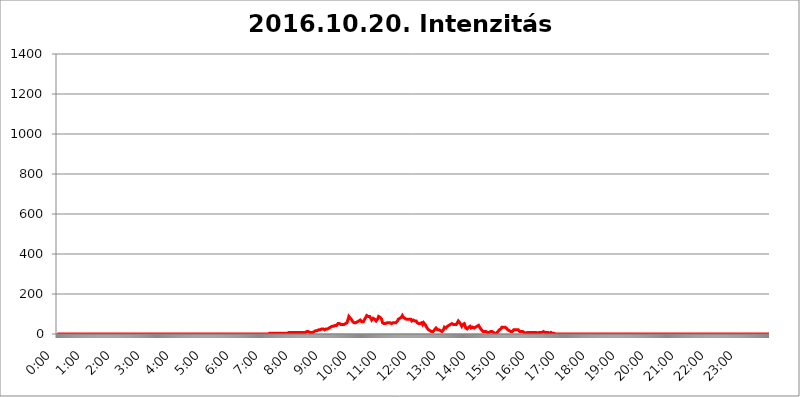
| Category | 2016.10.20. Intenzitás [W/m^2] |
|---|---|
| 0.0 | 0 |
| 0.0006944444444444445 | 0 |
| 0.001388888888888889 | 0 |
| 0.0020833333333333333 | 0 |
| 0.002777777777777778 | 0 |
| 0.003472222222222222 | 0 |
| 0.004166666666666667 | 0 |
| 0.004861111111111111 | 0 |
| 0.005555555555555556 | 0 |
| 0.0062499999999999995 | 0 |
| 0.006944444444444444 | 0 |
| 0.007638888888888889 | 0 |
| 0.008333333333333333 | 0 |
| 0.009027777777777779 | 0 |
| 0.009722222222222222 | 0 |
| 0.010416666666666666 | 0 |
| 0.011111111111111112 | 0 |
| 0.011805555555555555 | 0 |
| 0.012499999999999999 | 0 |
| 0.013194444444444444 | 0 |
| 0.013888888888888888 | 0 |
| 0.014583333333333332 | 0 |
| 0.015277777777777777 | 0 |
| 0.015972222222222224 | 0 |
| 0.016666666666666666 | 0 |
| 0.017361111111111112 | 0 |
| 0.018055555555555557 | 0 |
| 0.01875 | 0 |
| 0.019444444444444445 | 0 |
| 0.02013888888888889 | 0 |
| 0.020833333333333332 | 0 |
| 0.02152777777777778 | 0 |
| 0.022222222222222223 | 0 |
| 0.02291666666666667 | 0 |
| 0.02361111111111111 | 0 |
| 0.024305555555555556 | 0 |
| 0.024999999999999998 | 0 |
| 0.025694444444444447 | 0 |
| 0.02638888888888889 | 0 |
| 0.027083333333333334 | 0 |
| 0.027777777777777776 | 0 |
| 0.02847222222222222 | 0 |
| 0.029166666666666664 | 0 |
| 0.029861111111111113 | 0 |
| 0.030555555555555555 | 0 |
| 0.03125 | 0 |
| 0.03194444444444445 | 0 |
| 0.03263888888888889 | 0 |
| 0.03333333333333333 | 0 |
| 0.034027777777777775 | 0 |
| 0.034722222222222224 | 0 |
| 0.035416666666666666 | 0 |
| 0.036111111111111115 | 0 |
| 0.03680555555555556 | 0 |
| 0.0375 | 0 |
| 0.03819444444444444 | 0 |
| 0.03888888888888889 | 0 |
| 0.03958333333333333 | 0 |
| 0.04027777777777778 | 0 |
| 0.04097222222222222 | 0 |
| 0.041666666666666664 | 0 |
| 0.042361111111111106 | 0 |
| 0.04305555555555556 | 0 |
| 0.043750000000000004 | 0 |
| 0.044444444444444446 | 0 |
| 0.04513888888888889 | 0 |
| 0.04583333333333334 | 0 |
| 0.04652777777777778 | 0 |
| 0.04722222222222222 | 0 |
| 0.04791666666666666 | 0 |
| 0.04861111111111111 | 0 |
| 0.049305555555555554 | 0 |
| 0.049999999999999996 | 0 |
| 0.05069444444444445 | 0 |
| 0.051388888888888894 | 0 |
| 0.052083333333333336 | 0 |
| 0.05277777777777778 | 0 |
| 0.05347222222222222 | 0 |
| 0.05416666666666667 | 0 |
| 0.05486111111111111 | 0 |
| 0.05555555555555555 | 0 |
| 0.05625 | 0 |
| 0.05694444444444444 | 0 |
| 0.057638888888888885 | 0 |
| 0.05833333333333333 | 0 |
| 0.05902777777777778 | 0 |
| 0.059722222222222225 | 0 |
| 0.06041666666666667 | 0 |
| 0.061111111111111116 | 0 |
| 0.06180555555555556 | 0 |
| 0.0625 | 0 |
| 0.06319444444444444 | 0 |
| 0.06388888888888888 | 0 |
| 0.06458333333333334 | 0 |
| 0.06527777777777778 | 0 |
| 0.06597222222222222 | 0 |
| 0.06666666666666667 | 0 |
| 0.06736111111111111 | 0 |
| 0.06805555555555555 | 0 |
| 0.06874999999999999 | 0 |
| 0.06944444444444443 | 0 |
| 0.07013888888888889 | 0 |
| 0.07083333333333333 | 0 |
| 0.07152777777777779 | 0 |
| 0.07222222222222223 | 0 |
| 0.07291666666666667 | 0 |
| 0.07361111111111111 | 0 |
| 0.07430555555555556 | 0 |
| 0.075 | 0 |
| 0.07569444444444444 | 0 |
| 0.0763888888888889 | 0 |
| 0.07708333333333334 | 0 |
| 0.07777777777777778 | 0 |
| 0.07847222222222222 | 0 |
| 0.07916666666666666 | 0 |
| 0.0798611111111111 | 0 |
| 0.08055555555555556 | 0 |
| 0.08125 | 0 |
| 0.08194444444444444 | 0 |
| 0.08263888888888889 | 0 |
| 0.08333333333333333 | 0 |
| 0.08402777777777777 | 0 |
| 0.08472222222222221 | 0 |
| 0.08541666666666665 | 0 |
| 0.08611111111111112 | 0 |
| 0.08680555555555557 | 0 |
| 0.08750000000000001 | 0 |
| 0.08819444444444445 | 0 |
| 0.08888888888888889 | 0 |
| 0.08958333333333333 | 0 |
| 0.09027777777777778 | 0 |
| 0.09097222222222222 | 0 |
| 0.09166666666666667 | 0 |
| 0.09236111111111112 | 0 |
| 0.09305555555555556 | 0 |
| 0.09375 | 0 |
| 0.09444444444444444 | 0 |
| 0.09513888888888888 | 0 |
| 0.09583333333333333 | 0 |
| 0.09652777777777777 | 0 |
| 0.09722222222222222 | 0 |
| 0.09791666666666667 | 0 |
| 0.09861111111111111 | 0 |
| 0.09930555555555555 | 0 |
| 0.09999999999999999 | 0 |
| 0.10069444444444443 | 0 |
| 0.1013888888888889 | 0 |
| 0.10208333333333335 | 0 |
| 0.10277777777777779 | 0 |
| 0.10347222222222223 | 0 |
| 0.10416666666666667 | 0 |
| 0.10486111111111111 | 0 |
| 0.10555555555555556 | 0 |
| 0.10625 | 0 |
| 0.10694444444444444 | 0 |
| 0.1076388888888889 | 0 |
| 0.10833333333333334 | 0 |
| 0.10902777777777778 | 0 |
| 0.10972222222222222 | 0 |
| 0.1111111111111111 | 0 |
| 0.11180555555555556 | 0 |
| 0.11180555555555556 | 0 |
| 0.1125 | 0 |
| 0.11319444444444444 | 0 |
| 0.11388888888888889 | 0 |
| 0.11458333333333333 | 0 |
| 0.11527777777777777 | 0 |
| 0.11597222222222221 | 0 |
| 0.11666666666666665 | 0 |
| 0.1173611111111111 | 0 |
| 0.11805555555555557 | 0 |
| 0.11944444444444445 | 0 |
| 0.12013888888888889 | 0 |
| 0.12083333333333333 | 0 |
| 0.12152777777777778 | 0 |
| 0.12222222222222223 | 0 |
| 0.12291666666666667 | 0 |
| 0.12291666666666667 | 0 |
| 0.12361111111111112 | 0 |
| 0.12430555555555556 | 0 |
| 0.125 | 0 |
| 0.12569444444444444 | 0 |
| 0.12638888888888888 | 0 |
| 0.12708333333333333 | 0 |
| 0.16875 | 0 |
| 0.12847222222222224 | 0 |
| 0.12916666666666668 | 0 |
| 0.12986111111111112 | 0 |
| 0.13055555555555556 | 0 |
| 0.13125 | 0 |
| 0.13194444444444445 | 0 |
| 0.1326388888888889 | 0 |
| 0.13333333333333333 | 0 |
| 0.13402777777777777 | 0 |
| 0.13402777777777777 | 0 |
| 0.13472222222222222 | 0 |
| 0.13541666666666666 | 0 |
| 0.1361111111111111 | 0 |
| 0.13749999999999998 | 0 |
| 0.13819444444444443 | 0 |
| 0.1388888888888889 | 0 |
| 0.13958333333333334 | 0 |
| 0.14027777777777778 | 0 |
| 0.14097222222222222 | 0 |
| 0.14166666666666666 | 0 |
| 0.1423611111111111 | 0 |
| 0.14305555555555557 | 0 |
| 0.14375000000000002 | 0 |
| 0.14444444444444446 | 0 |
| 0.1451388888888889 | 0 |
| 0.1451388888888889 | 0 |
| 0.14652777777777778 | 0 |
| 0.14722222222222223 | 0 |
| 0.14791666666666667 | 0 |
| 0.1486111111111111 | 0 |
| 0.14930555555555555 | 0 |
| 0.15 | 0 |
| 0.15069444444444444 | 0 |
| 0.15138888888888888 | 0 |
| 0.15208333333333332 | 0 |
| 0.15277777777777776 | 0 |
| 0.15347222222222223 | 0 |
| 0.15416666666666667 | 0 |
| 0.15486111111111112 | 0 |
| 0.15555555555555556 | 0 |
| 0.15625 | 0 |
| 0.15694444444444444 | 0 |
| 0.15763888888888888 | 0 |
| 0.15833333333333333 | 0 |
| 0.15902777777777777 | 0 |
| 0.15972222222222224 | 0 |
| 0.16041666666666668 | 0 |
| 0.16111111111111112 | 0 |
| 0.16180555555555556 | 0 |
| 0.1625 | 0 |
| 0.16319444444444445 | 0 |
| 0.1638888888888889 | 0 |
| 0.16458333333333333 | 0 |
| 0.16527777777777777 | 0 |
| 0.16597222222222222 | 0 |
| 0.16666666666666666 | 0 |
| 0.1673611111111111 | 0 |
| 0.16805555555555554 | 0 |
| 0.16874999999999998 | 0 |
| 0.16944444444444443 | 0 |
| 0.17013888888888887 | 0 |
| 0.1708333333333333 | 0 |
| 0.17152777777777775 | 0 |
| 0.17222222222222225 | 0 |
| 0.1729166666666667 | 0 |
| 0.17361111111111113 | 0 |
| 0.17430555555555557 | 0 |
| 0.17500000000000002 | 0 |
| 0.17569444444444446 | 0 |
| 0.1763888888888889 | 0 |
| 0.17708333333333334 | 0 |
| 0.17777777777777778 | 0 |
| 0.17847222222222223 | 0 |
| 0.17916666666666667 | 0 |
| 0.1798611111111111 | 0 |
| 0.18055555555555555 | 0 |
| 0.18125 | 0 |
| 0.18194444444444444 | 0 |
| 0.1826388888888889 | 0 |
| 0.18333333333333335 | 0 |
| 0.1840277777777778 | 0 |
| 0.18472222222222223 | 0 |
| 0.18541666666666667 | 0 |
| 0.18611111111111112 | 0 |
| 0.18680555555555556 | 0 |
| 0.1875 | 0 |
| 0.18819444444444444 | 0 |
| 0.18888888888888888 | 0 |
| 0.18958333333333333 | 0 |
| 0.19027777777777777 | 0 |
| 0.1909722222222222 | 0 |
| 0.19166666666666665 | 0 |
| 0.19236111111111112 | 0 |
| 0.19305555555555554 | 0 |
| 0.19375 | 0 |
| 0.19444444444444445 | 0 |
| 0.1951388888888889 | 0 |
| 0.19583333333333333 | 0 |
| 0.19652777777777777 | 0 |
| 0.19722222222222222 | 0 |
| 0.19791666666666666 | 0 |
| 0.1986111111111111 | 0 |
| 0.19930555555555554 | 0 |
| 0.19999999999999998 | 0 |
| 0.20069444444444443 | 0 |
| 0.20138888888888887 | 0 |
| 0.2020833333333333 | 0 |
| 0.2027777777777778 | 0 |
| 0.2034722222222222 | 0 |
| 0.2041666666666667 | 0 |
| 0.20486111111111113 | 0 |
| 0.20555555555555557 | 0 |
| 0.20625000000000002 | 0 |
| 0.20694444444444446 | 0 |
| 0.2076388888888889 | 0 |
| 0.20833333333333334 | 0 |
| 0.20902777777777778 | 0 |
| 0.20972222222222223 | 0 |
| 0.21041666666666667 | 0 |
| 0.2111111111111111 | 0 |
| 0.21180555555555555 | 0 |
| 0.2125 | 0 |
| 0.21319444444444444 | 0 |
| 0.2138888888888889 | 0 |
| 0.21458333333333335 | 0 |
| 0.2152777777777778 | 0 |
| 0.21597222222222223 | 0 |
| 0.21666666666666667 | 0 |
| 0.21736111111111112 | 0 |
| 0.21805555555555556 | 0 |
| 0.21875 | 0 |
| 0.21944444444444444 | 0 |
| 0.22013888888888888 | 0 |
| 0.22083333333333333 | 0 |
| 0.22152777777777777 | 0 |
| 0.2222222222222222 | 0 |
| 0.22291666666666665 | 0 |
| 0.2236111111111111 | 0 |
| 0.22430555555555556 | 0 |
| 0.225 | 0 |
| 0.22569444444444445 | 0 |
| 0.2263888888888889 | 0 |
| 0.22708333333333333 | 0 |
| 0.22777777777777777 | 0 |
| 0.22847222222222222 | 0 |
| 0.22916666666666666 | 0 |
| 0.2298611111111111 | 0 |
| 0.23055555555555554 | 0 |
| 0.23124999999999998 | 0 |
| 0.23194444444444443 | 0 |
| 0.23263888888888887 | 0 |
| 0.2333333333333333 | 0 |
| 0.2340277777777778 | 0 |
| 0.2347222222222222 | 0 |
| 0.2354166666666667 | 0 |
| 0.23611111111111113 | 0 |
| 0.23680555555555557 | 0 |
| 0.23750000000000002 | 0 |
| 0.23819444444444446 | 0 |
| 0.2388888888888889 | 0 |
| 0.23958333333333334 | 0 |
| 0.24027777777777778 | 0 |
| 0.24097222222222223 | 0 |
| 0.24166666666666667 | 0 |
| 0.2423611111111111 | 0 |
| 0.24305555555555555 | 0 |
| 0.24375 | 0 |
| 0.24444444444444446 | 0 |
| 0.24513888888888888 | 0 |
| 0.24583333333333335 | 0 |
| 0.2465277777777778 | 0 |
| 0.24722222222222223 | 0 |
| 0.24791666666666667 | 0 |
| 0.24861111111111112 | 0 |
| 0.24930555555555556 | 0 |
| 0.25 | 0 |
| 0.25069444444444444 | 0 |
| 0.2513888888888889 | 0 |
| 0.2520833333333333 | 0 |
| 0.25277777777777777 | 0 |
| 0.2534722222222222 | 0 |
| 0.25416666666666665 | 0 |
| 0.2548611111111111 | 0 |
| 0.2555555555555556 | 0 |
| 0.25625000000000003 | 0 |
| 0.2569444444444445 | 0 |
| 0.2576388888888889 | 0 |
| 0.25833333333333336 | 0 |
| 0.2590277777777778 | 0 |
| 0.25972222222222224 | 0 |
| 0.2604166666666667 | 0 |
| 0.2611111111111111 | 0 |
| 0.26180555555555557 | 0 |
| 0.2625 | 0 |
| 0.26319444444444445 | 0 |
| 0.2638888888888889 | 0 |
| 0.26458333333333334 | 0 |
| 0.2652777777777778 | 0 |
| 0.2659722222222222 | 0 |
| 0.26666666666666666 | 0 |
| 0.2673611111111111 | 0 |
| 0.26805555555555555 | 0 |
| 0.26875 | 0 |
| 0.26944444444444443 | 0 |
| 0.2701388888888889 | 0 |
| 0.2708333333333333 | 0 |
| 0.27152777777777776 | 0 |
| 0.2722222222222222 | 0 |
| 0.27291666666666664 | 0 |
| 0.2736111111111111 | 0 |
| 0.2743055555555555 | 0 |
| 0.27499999999999997 | 0 |
| 0.27569444444444446 | 0 |
| 0.27638888888888885 | 0 |
| 0.27708333333333335 | 0 |
| 0.2777777777777778 | 0 |
| 0.27847222222222223 | 0 |
| 0.2791666666666667 | 0 |
| 0.2798611111111111 | 0 |
| 0.28055555555555556 | 0 |
| 0.28125 | 0 |
| 0.28194444444444444 | 0 |
| 0.2826388888888889 | 0 |
| 0.2833333333333333 | 0 |
| 0.28402777777777777 | 0 |
| 0.2847222222222222 | 0 |
| 0.28541666666666665 | 0 |
| 0.28611111111111115 | 0 |
| 0.28680555555555554 | 0 |
| 0.28750000000000003 | 0 |
| 0.2881944444444445 | 0 |
| 0.2888888888888889 | 0 |
| 0.28958333333333336 | 0 |
| 0.2902777777777778 | 0 |
| 0.29097222222222224 | 0 |
| 0.2916666666666667 | 0 |
| 0.2923611111111111 | 0 |
| 0.29305555555555557 | 0 |
| 0.29375 | 0 |
| 0.29444444444444445 | 0 |
| 0.2951388888888889 | 0 |
| 0.29583333333333334 | 0 |
| 0.2965277777777778 | 0 |
| 0.2972222222222222 | 0 |
| 0.29791666666666666 | 3.525 |
| 0.2986111111111111 | 3.525 |
| 0.29930555555555555 | 3.525 |
| 0.3 | 3.525 |
| 0.30069444444444443 | 3.525 |
| 0.3013888888888889 | 3.525 |
| 0.3020833333333333 | 3.525 |
| 0.30277777777777776 | 3.525 |
| 0.3034722222222222 | 3.525 |
| 0.30416666666666664 | 3.525 |
| 0.3048611111111111 | 3.525 |
| 0.3055555555555555 | 3.525 |
| 0.30624999999999997 | 3.525 |
| 0.3069444444444444 | 3.525 |
| 0.3076388888888889 | 3.525 |
| 0.30833333333333335 | 3.525 |
| 0.3090277777777778 | 3.525 |
| 0.30972222222222223 | 3.525 |
| 0.3104166666666667 | 3.525 |
| 0.3111111111111111 | 3.525 |
| 0.31180555555555556 | 3.525 |
| 0.3125 | 3.525 |
| 0.31319444444444444 | 3.525 |
| 0.3138888888888889 | 3.525 |
| 0.3145833333333333 | 3.525 |
| 0.31527777777777777 | 3.525 |
| 0.3159722222222222 | 3.525 |
| 0.31666666666666665 | 3.525 |
| 0.31736111111111115 | 3.525 |
| 0.31805555555555554 | 3.525 |
| 0.31875000000000003 | 3.525 |
| 0.3194444444444445 | 3.525 |
| 0.3201388888888889 | 3.525 |
| 0.32083333333333336 | 3.525 |
| 0.3215277777777778 | 3.525 |
| 0.32222222222222224 | 3.525 |
| 0.3229166666666667 | 3.525 |
| 0.3236111111111111 | 3.525 |
| 0.32430555555555557 | 7.887 |
| 0.325 | 7.887 |
| 0.32569444444444445 | 7.887 |
| 0.3263888888888889 | 7.887 |
| 0.32708333333333334 | 7.887 |
| 0.3277777777777778 | 7.887 |
| 0.3284722222222222 | 7.887 |
| 0.32916666666666666 | 7.887 |
| 0.3298611111111111 | 7.887 |
| 0.33055555555555555 | 7.887 |
| 0.33125 | 7.887 |
| 0.33194444444444443 | 7.887 |
| 0.3326388888888889 | 7.887 |
| 0.3333333333333333 | 7.887 |
| 0.3340277777777778 | 7.887 |
| 0.3347222222222222 | 7.887 |
| 0.3354166666666667 | 7.887 |
| 0.3361111111111111 | 7.887 |
| 0.3368055555555556 | 7.887 |
| 0.33749999999999997 | 7.887 |
| 0.33819444444444446 | 7.887 |
| 0.33888888888888885 | 7.887 |
| 0.33958333333333335 | 7.887 |
| 0.34027777777777773 | 3.525 |
| 0.34097222222222223 | 3.525 |
| 0.3416666666666666 | 7.887 |
| 0.3423611111111111 | 7.887 |
| 0.3430555555555555 | 7.887 |
| 0.34375 | 7.887 |
| 0.3444444444444445 | 7.887 |
| 0.3451388888888889 | 7.887 |
| 0.3458333333333334 | 7.887 |
| 0.34652777777777777 | 7.887 |
| 0.34722222222222227 | 7.887 |
| 0.34791666666666665 | 7.887 |
| 0.34861111111111115 | 12.257 |
| 0.34930555555555554 | 12.257 |
| 0.35000000000000003 | 12.257 |
| 0.3506944444444444 | 12.257 |
| 0.3513888888888889 | 12.257 |
| 0.3520833333333333 | 12.257 |
| 0.3527777777777778 | 7.887 |
| 0.3534722222222222 | 7.887 |
| 0.3541666666666667 | 7.887 |
| 0.3548611111111111 | 7.887 |
| 0.35555555555555557 | 7.887 |
| 0.35625 | 7.887 |
| 0.35694444444444445 | 7.887 |
| 0.3576388888888889 | 7.887 |
| 0.35833333333333334 | 7.887 |
| 0.3590277777777778 | 12.257 |
| 0.3597222222222222 | 12.257 |
| 0.36041666666666666 | 12.257 |
| 0.3611111111111111 | 12.257 |
| 0.36180555555555555 | 12.257 |
| 0.3625 | 16.636 |
| 0.36319444444444443 | 16.636 |
| 0.3638888888888889 | 16.636 |
| 0.3645833333333333 | 16.636 |
| 0.3652777777777778 | 16.636 |
| 0.3659722222222222 | 16.636 |
| 0.3666666666666667 | 21.024 |
| 0.3673611111111111 | 21.024 |
| 0.3680555555555556 | 21.024 |
| 0.36874999999999997 | 21.024 |
| 0.36944444444444446 | 21.024 |
| 0.37013888888888885 | 21.024 |
| 0.37083333333333335 | 25.419 |
| 0.37152777777777773 | 21.024 |
| 0.37222222222222223 | 21.024 |
| 0.3729166666666666 | 25.419 |
| 0.3736111111111111 | 25.419 |
| 0.3743055555555555 | 21.024 |
| 0.375 | 21.024 |
| 0.3756944444444445 | 21.024 |
| 0.3763888888888889 | 21.024 |
| 0.3770833333333334 | 25.419 |
| 0.37777777777777777 | 25.419 |
| 0.37847222222222227 | 25.419 |
| 0.37916666666666665 | 25.419 |
| 0.37986111111111115 | 25.419 |
| 0.38055555555555554 | 29.823 |
| 0.38125000000000003 | 29.823 |
| 0.3819444444444444 | 29.823 |
| 0.3826388888888889 | 29.823 |
| 0.3833333333333333 | 34.234 |
| 0.3840277777777778 | 34.234 |
| 0.3847222222222222 | 38.653 |
| 0.3854166666666667 | 38.653 |
| 0.3861111111111111 | 38.653 |
| 0.38680555555555557 | 38.653 |
| 0.3875 | 38.653 |
| 0.38819444444444445 | 43.079 |
| 0.3888888888888889 | 43.079 |
| 0.38958333333333334 | 43.079 |
| 0.3902777777777778 | 43.079 |
| 0.3909722222222222 | 43.079 |
| 0.39166666666666666 | 43.079 |
| 0.3923611111111111 | 47.511 |
| 0.39305555555555555 | 47.511 |
| 0.39375 | 51.951 |
| 0.39444444444444443 | 51.951 |
| 0.3951388888888889 | 51.951 |
| 0.3958333333333333 | 51.951 |
| 0.3965277777777778 | 51.951 |
| 0.3972222222222222 | 51.951 |
| 0.3979166666666667 | 47.511 |
| 0.3986111111111111 | 47.511 |
| 0.3993055555555556 | 47.511 |
| 0.39999999999999997 | 47.511 |
| 0.40069444444444446 | 47.511 |
| 0.40138888888888885 | 43.079 |
| 0.40208333333333335 | 47.511 |
| 0.40277777777777773 | 47.511 |
| 0.40347222222222223 | 51.951 |
| 0.4041666666666666 | 51.951 |
| 0.4048611111111111 | 56.398 |
| 0.4055555555555555 | 56.398 |
| 0.40625 | 56.398 |
| 0.4069444444444445 | 60.85 |
| 0.4076388888888889 | 69.775 |
| 0.4083333333333334 | 78.722 |
| 0.40902777777777777 | 87.692 |
| 0.40972222222222227 | 83.205 |
| 0.41041666666666665 | 83.205 |
| 0.41111111111111115 | 78.722 |
| 0.41180555555555554 | 78.722 |
| 0.41250000000000003 | 74.246 |
| 0.4131944444444444 | 69.775 |
| 0.4138888888888889 | 65.31 |
| 0.4145833333333333 | 60.85 |
| 0.4152777777777778 | 56.398 |
| 0.4159722222222222 | 56.398 |
| 0.4166666666666667 | 56.398 |
| 0.4173611111111111 | 56.398 |
| 0.41805555555555557 | 56.398 |
| 0.41875 | 56.398 |
| 0.41944444444444445 | 56.398 |
| 0.4201388888888889 | 60.85 |
| 0.42083333333333334 | 60.85 |
| 0.4215277777777778 | 60.85 |
| 0.4222222222222222 | 65.31 |
| 0.42291666666666666 | 65.31 |
| 0.4236111111111111 | 69.775 |
| 0.42430555555555555 | 69.775 |
| 0.425 | 69.775 |
| 0.42569444444444443 | 69.775 |
| 0.4263888888888889 | 65.31 |
| 0.4270833333333333 | 60.85 |
| 0.4277777777777778 | 60.85 |
| 0.4284722222222222 | 56.398 |
| 0.4291666666666667 | 60.85 |
| 0.4298611111111111 | 65.31 |
| 0.4305555555555556 | 69.775 |
| 0.43124999999999997 | 69.775 |
| 0.43194444444444446 | 74.246 |
| 0.43263888888888885 | 83.205 |
| 0.43333333333333335 | 87.692 |
| 0.43402777777777773 | 92.184 |
| 0.43472222222222223 | 92.184 |
| 0.4354166666666666 | 92.184 |
| 0.4361111111111111 | 87.692 |
| 0.4368055555555555 | 87.692 |
| 0.4375 | 92.184 |
| 0.4381944444444445 | 87.692 |
| 0.4388888888888889 | 87.692 |
| 0.4395833333333334 | 78.722 |
| 0.44027777777777777 | 74.246 |
| 0.44097222222222227 | 69.775 |
| 0.44166666666666665 | 74.246 |
| 0.44236111111111115 | 74.246 |
| 0.44305555555555554 | 78.722 |
| 0.44375000000000003 | 74.246 |
| 0.4444444444444444 | 74.246 |
| 0.4451388888888889 | 74.246 |
| 0.4458333333333333 | 69.775 |
| 0.4465277777777778 | 69.775 |
| 0.4472222222222222 | 65.31 |
| 0.4479166666666667 | 69.775 |
| 0.4486111111111111 | 69.775 |
| 0.44930555555555557 | 74.246 |
| 0.45 | 74.246 |
| 0.45069444444444445 | 87.692 |
| 0.4513888888888889 | 83.205 |
| 0.45208333333333334 | 83.205 |
| 0.4527777777777778 | 83.205 |
| 0.4534722222222222 | 87.692 |
| 0.45416666666666666 | 83.205 |
| 0.4548611111111111 | 74.246 |
| 0.45555555555555555 | 65.31 |
| 0.45625 | 56.398 |
| 0.45694444444444443 | 56.398 |
| 0.4576388888888889 | 51.951 |
| 0.4583333333333333 | 51.951 |
| 0.4590277777777778 | 47.511 |
| 0.4597222222222222 | 51.951 |
| 0.4604166666666667 | 51.951 |
| 0.4611111111111111 | 56.398 |
| 0.4618055555555556 | 56.398 |
| 0.46249999999999997 | 56.398 |
| 0.46319444444444446 | 56.398 |
| 0.46388888888888885 | 56.398 |
| 0.46458333333333335 | 56.398 |
| 0.46527777777777773 | 56.398 |
| 0.46597222222222223 | 56.398 |
| 0.4666666666666666 | 56.398 |
| 0.4673611111111111 | 51.951 |
| 0.4680555555555555 | 51.951 |
| 0.46875 | 51.951 |
| 0.4694444444444445 | 51.951 |
| 0.4701388888888889 | 56.398 |
| 0.4708333333333334 | 56.398 |
| 0.47152777777777777 | 56.398 |
| 0.47222222222222227 | 56.398 |
| 0.47291666666666665 | 56.398 |
| 0.47361111111111115 | 56.398 |
| 0.47430555555555554 | 56.398 |
| 0.47500000000000003 | 56.398 |
| 0.4756944444444444 | 56.398 |
| 0.4763888888888889 | 56.398 |
| 0.4770833333333333 | 65.31 |
| 0.4777777777777778 | 65.31 |
| 0.4784722222222222 | 74.246 |
| 0.4791666666666667 | 74.246 |
| 0.4798611111111111 | 78.722 |
| 0.48055555555555557 | 78.722 |
| 0.48125 | 83.205 |
| 0.48194444444444445 | 78.722 |
| 0.4826388888888889 | 83.205 |
| 0.48333333333333334 | 83.205 |
| 0.4840277777777778 | 92.184 |
| 0.4847222222222222 | 87.692 |
| 0.48541666666666666 | 83.205 |
| 0.4861111111111111 | 83.205 |
| 0.48680555555555555 | 78.722 |
| 0.4875 | 78.722 |
| 0.48819444444444443 | 74.246 |
| 0.4888888888888889 | 74.246 |
| 0.4895833333333333 | 74.246 |
| 0.4902777777777778 | 74.246 |
| 0.4909722222222222 | 74.246 |
| 0.4916666666666667 | 74.246 |
| 0.4923611111111111 | 74.246 |
| 0.4930555555555556 | 74.246 |
| 0.49374999999999997 | 74.246 |
| 0.49444444444444446 | 74.246 |
| 0.49513888888888885 | 74.246 |
| 0.49583333333333335 | 74.246 |
| 0.49652777777777773 | 69.775 |
| 0.49722222222222223 | 65.31 |
| 0.4979166666666666 | 65.31 |
| 0.4986111111111111 | 65.31 |
| 0.4993055555555555 | 69.775 |
| 0.5 | 69.775 |
| 0.5006944444444444 | 69.775 |
| 0.5013888888888889 | 65.31 |
| 0.5020833333333333 | 69.775 |
| 0.5027777777777778 | 69.775 |
| 0.5034722222222222 | 65.31 |
| 0.5041666666666667 | 60.85 |
| 0.5048611111111111 | 56.398 |
| 0.5055555555555555 | 51.951 |
| 0.50625 | 51.951 |
| 0.5069444444444444 | 51.951 |
| 0.5076388888888889 | 51.951 |
| 0.5083333333333333 | 51.951 |
| 0.5090277777777777 | 51.951 |
| 0.5097222222222222 | 56.398 |
| 0.5104166666666666 | 56.398 |
| 0.5111111111111112 | 56.398 |
| 0.5118055555555555 | 51.951 |
| 0.5125000000000001 | 47.511 |
| 0.5131944444444444 | 51.951 |
| 0.513888888888889 | 56.398 |
| 0.5145833333333333 | 56.398 |
| 0.5152777777777778 | 56.398 |
| 0.5159722222222222 | 47.511 |
| 0.5166666666666667 | 43.079 |
| 0.517361111111111 | 38.653 |
| 0.5180555555555556 | 34.234 |
| 0.5187499999999999 | 29.823 |
| 0.5194444444444445 | 29.823 |
| 0.5201388888888888 | 25.419 |
| 0.5208333333333334 | 21.024 |
| 0.5215277777777778 | 21.024 |
| 0.5222222222222223 | 16.636 |
| 0.5229166666666667 | 16.636 |
| 0.5236111111111111 | 12.257 |
| 0.5243055555555556 | 12.257 |
| 0.525 | 12.257 |
| 0.5256944444444445 | 12.257 |
| 0.5263888888888889 | 7.887 |
| 0.5270833333333333 | 12.257 |
| 0.5277777777777778 | 12.257 |
| 0.5284722222222222 | 16.636 |
| 0.5291666666666667 | 21.024 |
| 0.5298611111111111 | 21.024 |
| 0.5305555555555556 | 25.419 |
| 0.53125 | 29.823 |
| 0.5319444444444444 | 25.419 |
| 0.5326388888888889 | 25.419 |
| 0.5333333333333333 | 21.024 |
| 0.5340277777777778 | 21.024 |
| 0.5347222222222222 | 21.024 |
| 0.5354166666666667 | 21.024 |
| 0.5361111111111111 | 21.024 |
| 0.5368055555555555 | 21.024 |
| 0.5375 | 16.636 |
| 0.5381944444444444 | 12.257 |
| 0.5388888888888889 | 12.257 |
| 0.5395833333333333 | 12.257 |
| 0.5402777777777777 | 12.257 |
| 0.5409722222222222 | 16.636 |
| 0.5416666666666666 | 21.024 |
| 0.5423611111111112 | 25.419 |
| 0.5430555555555555 | 34.234 |
| 0.5437500000000001 | 34.234 |
| 0.5444444444444444 | 34.234 |
| 0.545138888888889 | 29.823 |
| 0.5458333333333333 | 29.823 |
| 0.5465277777777778 | 34.234 |
| 0.5472222222222222 | 38.653 |
| 0.5479166666666667 | 43.079 |
| 0.548611111111111 | 43.079 |
| 0.5493055555555556 | 43.079 |
| 0.5499999999999999 | 43.079 |
| 0.5506944444444445 | 43.079 |
| 0.5513888888888888 | 47.511 |
| 0.5520833333333334 | 47.511 |
| 0.5527777777777778 | 47.511 |
| 0.5534722222222223 | 51.951 |
| 0.5541666666666667 | 51.951 |
| 0.5548611111111111 | 51.951 |
| 0.5555555555555556 | 47.511 |
| 0.55625 | 47.511 |
| 0.5569444444444445 | 47.511 |
| 0.5576388888888889 | 47.511 |
| 0.5583333333333333 | 47.511 |
| 0.5590277777777778 | 47.511 |
| 0.5597222222222222 | 47.511 |
| 0.5604166666666667 | 51.951 |
| 0.5611111111111111 | 56.398 |
| 0.5618055555555556 | 60.85 |
| 0.5625 | 65.31 |
| 0.5631944444444444 | 60.85 |
| 0.5638888888888889 | 60.85 |
| 0.5645833333333333 | 56.398 |
| 0.5652777777777778 | 51.951 |
| 0.5659722222222222 | 47.511 |
| 0.5666666666666667 | 43.079 |
| 0.5673611111111111 | 38.653 |
| 0.5680555555555555 | 43.079 |
| 0.56875 | 47.511 |
| 0.5694444444444444 | 47.511 |
| 0.5701388888888889 | 51.951 |
| 0.5708333333333333 | 51.951 |
| 0.5715277777777777 | 47.511 |
| 0.5722222222222222 | 38.653 |
| 0.5729166666666666 | 29.823 |
| 0.5736111111111112 | 29.823 |
| 0.5743055555555555 | 25.419 |
| 0.5750000000000001 | 25.419 |
| 0.5756944444444444 | 25.419 |
| 0.576388888888889 | 29.823 |
| 0.5770833333333333 | 34.234 |
| 0.5777777777777778 | 34.234 |
| 0.5784722222222222 | 38.653 |
| 0.5791666666666667 | 38.653 |
| 0.579861111111111 | 34.234 |
| 0.5805555555555556 | 29.823 |
| 0.5812499999999999 | 29.823 |
| 0.5819444444444445 | 29.823 |
| 0.5826388888888888 | 34.234 |
| 0.5833333333333334 | 34.234 |
| 0.5840277777777778 | 34.234 |
| 0.5847222222222223 | 29.823 |
| 0.5854166666666667 | 29.823 |
| 0.5861111111111111 | 29.823 |
| 0.5868055555555556 | 34.234 |
| 0.5875 | 34.234 |
| 0.5881944444444445 | 34.234 |
| 0.5888888888888889 | 38.653 |
| 0.5895833333333333 | 43.079 |
| 0.5902777777777778 | 43.079 |
| 0.5909722222222222 | 43.079 |
| 0.5916666666666667 | 43.079 |
| 0.5923611111111111 | 38.653 |
| 0.5930555555555556 | 29.823 |
| 0.59375 | 29.823 |
| 0.5944444444444444 | 25.419 |
| 0.5951388888888889 | 21.024 |
| 0.5958333333333333 | 21.024 |
| 0.5965277777777778 | 16.636 |
| 0.5972222222222222 | 12.257 |
| 0.5979166666666667 | 12.257 |
| 0.5986111111111111 | 12.257 |
| 0.5993055555555555 | 12.257 |
| 0.6 | 12.257 |
| 0.6006944444444444 | 12.257 |
| 0.6013888888888889 | 12.257 |
| 0.6020833333333333 | 12.257 |
| 0.6027777777777777 | 7.887 |
| 0.6034722222222222 | 7.887 |
| 0.6041666666666666 | 7.887 |
| 0.6048611111111112 | 7.887 |
| 0.6055555555555555 | 7.887 |
| 0.6062500000000001 | 12.257 |
| 0.6069444444444444 | 12.257 |
| 0.607638888888889 | 12.257 |
| 0.6083333333333333 | 12.257 |
| 0.6090277777777778 | 12.257 |
| 0.6097222222222222 | 12.257 |
| 0.6104166666666667 | 7.887 |
| 0.611111111111111 | 7.887 |
| 0.6118055555555556 | 7.887 |
| 0.6124999999999999 | 7.887 |
| 0.6131944444444445 | 7.887 |
| 0.6138888888888888 | 3.525 |
| 0.6145833333333334 | 7.887 |
| 0.6152777777777778 | 3.525 |
| 0.6159722222222223 | 3.525 |
| 0.6166666666666667 | 3.525 |
| 0.6173611111111111 | 7.887 |
| 0.6180555555555556 | 12.257 |
| 0.61875 | 12.257 |
| 0.6194444444444445 | 16.636 |
| 0.6201388888888889 | 21.024 |
| 0.6208333333333333 | 21.024 |
| 0.6215277777777778 | 25.419 |
| 0.6222222222222222 | 25.419 |
| 0.6229166666666667 | 29.823 |
| 0.6236111111111111 | 34.234 |
| 0.6243055555555556 | 34.234 |
| 0.625 | 34.234 |
| 0.6256944444444444 | 34.234 |
| 0.6263888888888889 | 34.234 |
| 0.6270833333333333 | 34.234 |
| 0.6277777777777778 | 34.234 |
| 0.6284722222222222 | 34.234 |
| 0.6291666666666667 | 29.823 |
| 0.6298611111111111 | 29.823 |
| 0.6305555555555555 | 29.823 |
| 0.63125 | 25.419 |
| 0.6319444444444444 | 21.024 |
| 0.6326388888888889 | 21.024 |
| 0.6333333333333333 | 16.636 |
| 0.6340277777777777 | 16.636 |
| 0.6347222222222222 | 12.257 |
| 0.6354166666666666 | 12.257 |
| 0.6361111111111112 | 12.257 |
| 0.6368055555555555 | 12.257 |
| 0.6375000000000001 | 12.257 |
| 0.6381944444444444 | 12.257 |
| 0.638888888888889 | 16.636 |
| 0.6395833333333333 | 16.636 |
| 0.6402777777777778 | 21.024 |
| 0.6409722222222222 | 21.024 |
| 0.6416666666666667 | 21.024 |
| 0.642361111111111 | 21.024 |
| 0.6430555555555556 | 16.636 |
| 0.6437499999999999 | 21.024 |
| 0.6444444444444445 | 21.024 |
| 0.6451388888888888 | 21.024 |
| 0.6458333333333334 | 21.024 |
| 0.6465277777777778 | 21.024 |
| 0.6472222222222223 | 16.636 |
| 0.6479166666666667 | 16.636 |
| 0.6486111111111111 | 12.257 |
| 0.6493055555555556 | 12.257 |
| 0.65 | 12.257 |
| 0.6506944444444445 | 12.257 |
| 0.6513888888888889 | 12.257 |
| 0.6520833333333333 | 12.257 |
| 0.6527777777777778 | 12.257 |
| 0.6534722222222222 | 7.887 |
| 0.6541666666666667 | 7.887 |
| 0.6548611111111111 | 7.887 |
| 0.6555555555555556 | 7.887 |
| 0.65625 | 7.887 |
| 0.6569444444444444 | 3.525 |
| 0.6576388888888889 | 7.887 |
| 0.6583333333333333 | 7.887 |
| 0.6590277777777778 | 7.887 |
| 0.6597222222222222 | 7.887 |
| 0.6604166666666667 | 7.887 |
| 0.6611111111111111 | 7.887 |
| 0.6618055555555555 | 7.887 |
| 0.6625 | 7.887 |
| 0.6631944444444444 | 7.887 |
| 0.6638888888888889 | 3.525 |
| 0.6645833333333333 | 3.525 |
| 0.6652777777777777 | 7.887 |
| 0.6659722222222222 | 7.887 |
| 0.6666666666666666 | 7.887 |
| 0.6673611111111111 | 7.887 |
| 0.6680555555555556 | 7.887 |
| 0.6687500000000001 | 7.887 |
| 0.6694444444444444 | 7.887 |
| 0.6701388888888888 | 7.887 |
| 0.6708333333333334 | 7.887 |
| 0.6715277777777778 | 7.887 |
| 0.6722222222222222 | 7.887 |
| 0.6729166666666666 | 3.525 |
| 0.6736111111111112 | 3.525 |
| 0.6743055555555556 | 3.525 |
| 0.6749999999999999 | 3.525 |
| 0.6756944444444444 | 7.887 |
| 0.6763888888888889 | 3.525 |
| 0.6770833333333334 | 7.887 |
| 0.6777777777777777 | 7.887 |
| 0.6784722222222223 | 12.257 |
| 0.6791666666666667 | 7.887 |
| 0.6798611111111111 | 7.887 |
| 0.6805555555555555 | 12.257 |
| 0.68125 | 12.257 |
| 0.6819444444444445 | 12.257 |
| 0.6826388888888889 | 12.257 |
| 0.6833333333333332 | 12.257 |
| 0.6840277777777778 | 7.887 |
| 0.6847222222222222 | 7.887 |
| 0.6854166666666667 | 7.887 |
| 0.686111111111111 | 7.887 |
| 0.6868055555555556 | 7.887 |
| 0.6875 | 7.887 |
| 0.6881944444444444 | 7.887 |
| 0.688888888888889 | 7.887 |
| 0.6895833333333333 | 3.525 |
| 0.6902777777777778 | 3.525 |
| 0.6909722222222222 | 3.525 |
| 0.6916666666666668 | 7.887 |
| 0.6923611111111111 | 7.887 |
| 0.6930555555555555 | 7.887 |
| 0.69375 | 7.887 |
| 0.6944444444444445 | 3.525 |
| 0.6951388888888889 | 3.525 |
| 0.6958333333333333 | 3.525 |
| 0.6965277777777777 | 3.525 |
| 0.6972222222222223 | 3.525 |
| 0.6979166666666666 | 0 |
| 0.6986111111111111 | 0 |
| 0.6993055555555556 | 0 |
| 0.7000000000000001 | 0 |
| 0.7006944444444444 | 0 |
| 0.7013888888888888 | 0 |
| 0.7020833333333334 | 0 |
| 0.7027777777777778 | 0 |
| 0.7034722222222222 | 0 |
| 0.7041666666666666 | 0 |
| 0.7048611111111112 | 0 |
| 0.7055555555555556 | 0 |
| 0.7062499999999999 | 0 |
| 0.7069444444444444 | 0 |
| 0.7076388888888889 | 0 |
| 0.7083333333333334 | 0 |
| 0.7090277777777777 | 0 |
| 0.7097222222222223 | 0 |
| 0.7104166666666667 | 0 |
| 0.7111111111111111 | 0 |
| 0.7118055555555555 | 0 |
| 0.7125 | 0 |
| 0.7131944444444445 | 0 |
| 0.7138888888888889 | 0 |
| 0.7145833333333332 | 0 |
| 0.7152777777777778 | 0 |
| 0.7159722222222222 | 0 |
| 0.7166666666666667 | 0 |
| 0.717361111111111 | 0 |
| 0.7180555555555556 | 0 |
| 0.71875 | 0 |
| 0.7194444444444444 | 0 |
| 0.720138888888889 | 0 |
| 0.7208333333333333 | 0 |
| 0.7215277777777778 | 0 |
| 0.7222222222222222 | 0 |
| 0.7229166666666668 | 0 |
| 0.7236111111111111 | 0 |
| 0.7243055555555555 | 0 |
| 0.725 | 0 |
| 0.7256944444444445 | 0 |
| 0.7263888888888889 | 0 |
| 0.7270833333333333 | 0 |
| 0.7277777777777777 | 0 |
| 0.7284722222222223 | 0 |
| 0.7291666666666666 | 0 |
| 0.7298611111111111 | 0 |
| 0.7305555555555556 | 0 |
| 0.7312500000000001 | 0 |
| 0.7319444444444444 | 0 |
| 0.7326388888888888 | 0 |
| 0.7333333333333334 | 0 |
| 0.7340277777777778 | 0 |
| 0.7347222222222222 | 0 |
| 0.7354166666666666 | 0 |
| 0.7361111111111112 | 0 |
| 0.7368055555555556 | 0 |
| 0.7374999999999999 | 0 |
| 0.7381944444444444 | 0 |
| 0.7388888888888889 | 0 |
| 0.7395833333333334 | 0 |
| 0.7402777777777777 | 0 |
| 0.7409722222222223 | 0 |
| 0.7416666666666667 | 0 |
| 0.7423611111111111 | 0 |
| 0.7430555555555555 | 0 |
| 0.74375 | 0 |
| 0.7444444444444445 | 0 |
| 0.7451388888888889 | 0 |
| 0.7458333333333332 | 0 |
| 0.7465277777777778 | 0 |
| 0.7472222222222222 | 0 |
| 0.7479166666666667 | 0 |
| 0.748611111111111 | 0 |
| 0.7493055555555556 | 0 |
| 0.75 | 0 |
| 0.7506944444444444 | 0 |
| 0.751388888888889 | 0 |
| 0.7520833333333333 | 0 |
| 0.7527777777777778 | 0 |
| 0.7534722222222222 | 0 |
| 0.7541666666666668 | 0 |
| 0.7548611111111111 | 0 |
| 0.7555555555555555 | 0 |
| 0.75625 | 0 |
| 0.7569444444444445 | 0 |
| 0.7576388888888889 | 0 |
| 0.7583333333333333 | 0 |
| 0.7590277777777777 | 0 |
| 0.7597222222222223 | 0 |
| 0.7604166666666666 | 0 |
| 0.7611111111111111 | 0 |
| 0.7618055555555556 | 0 |
| 0.7625000000000001 | 0 |
| 0.7631944444444444 | 0 |
| 0.7638888888888888 | 0 |
| 0.7645833333333334 | 0 |
| 0.7652777777777778 | 0 |
| 0.7659722222222222 | 0 |
| 0.7666666666666666 | 0 |
| 0.7673611111111112 | 0 |
| 0.7680555555555556 | 0 |
| 0.7687499999999999 | 0 |
| 0.7694444444444444 | 0 |
| 0.7701388888888889 | 0 |
| 0.7708333333333334 | 0 |
| 0.7715277777777777 | 0 |
| 0.7722222222222223 | 0 |
| 0.7729166666666667 | 0 |
| 0.7736111111111111 | 0 |
| 0.7743055555555555 | 0 |
| 0.775 | 0 |
| 0.7756944444444445 | 0 |
| 0.7763888888888889 | 0 |
| 0.7770833333333332 | 0 |
| 0.7777777777777778 | 0 |
| 0.7784722222222222 | 0 |
| 0.7791666666666667 | 0 |
| 0.779861111111111 | 0 |
| 0.7805555555555556 | 0 |
| 0.78125 | 0 |
| 0.7819444444444444 | 0 |
| 0.782638888888889 | 0 |
| 0.7833333333333333 | 0 |
| 0.7840277777777778 | 0 |
| 0.7847222222222222 | 0 |
| 0.7854166666666668 | 0 |
| 0.7861111111111111 | 0 |
| 0.7868055555555555 | 0 |
| 0.7875 | 0 |
| 0.7881944444444445 | 0 |
| 0.7888888888888889 | 0 |
| 0.7895833333333333 | 0 |
| 0.7902777777777777 | 0 |
| 0.7909722222222223 | 0 |
| 0.7916666666666666 | 0 |
| 0.7923611111111111 | 0 |
| 0.7930555555555556 | 0 |
| 0.7937500000000001 | 0 |
| 0.7944444444444444 | 0 |
| 0.7951388888888888 | 0 |
| 0.7958333333333334 | 0 |
| 0.7965277777777778 | 0 |
| 0.7972222222222222 | 0 |
| 0.7979166666666666 | 0 |
| 0.7986111111111112 | 0 |
| 0.7993055555555556 | 0 |
| 0.7999999999999999 | 0 |
| 0.8006944444444444 | 0 |
| 0.8013888888888889 | 0 |
| 0.8020833333333334 | 0 |
| 0.8027777777777777 | 0 |
| 0.8034722222222223 | 0 |
| 0.8041666666666667 | 0 |
| 0.8048611111111111 | 0 |
| 0.8055555555555555 | 0 |
| 0.80625 | 0 |
| 0.8069444444444445 | 0 |
| 0.8076388888888889 | 0 |
| 0.8083333333333332 | 0 |
| 0.8090277777777778 | 0 |
| 0.8097222222222222 | 0 |
| 0.8104166666666667 | 0 |
| 0.811111111111111 | 0 |
| 0.8118055555555556 | 0 |
| 0.8125 | 0 |
| 0.8131944444444444 | 0 |
| 0.813888888888889 | 0 |
| 0.8145833333333333 | 0 |
| 0.8152777777777778 | 0 |
| 0.8159722222222222 | 0 |
| 0.8166666666666668 | 0 |
| 0.8173611111111111 | 0 |
| 0.8180555555555555 | 0 |
| 0.81875 | 0 |
| 0.8194444444444445 | 0 |
| 0.8201388888888889 | 0 |
| 0.8208333333333333 | 0 |
| 0.8215277777777777 | 0 |
| 0.8222222222222223 | 0 |
| 0.8229166666666666 | 0 |
| 0.8236111111111111 | 0 |
| 0.8243055555555556 | 0 |
| 0.8250000000000001 | 0 |
| 0.8256944444444444 | 0 |
| 0.8263888888888888 | 0 |
| 0.8270833333333334 | 0 |
| 0.8277777777777778 | 0 |
| 0.8284722222222222 | 0 |
| 0.8291666666666666 | 0 |
| 0.8298611111111112 | 0 |
| 0.8305555555555556 | 0 |
| 0.8312499999999999 | 0 |
| 0.8319444444444444 | 0 |
| 0.8326388888888889 | 0 |
| 0.8333333333333334 | 0 |
| 0.8340277777777777 | 0 |
| 0.8347222222222223 | 0 |
| 0.8354166666666667 | 0 |
| 0.8361111111111111 | 0 |
| 0.8368055555555555 | 0 |
| 0.8375 | 0 |
| 0.8381944444444445 | 0 |
| 0.8388888888888889 | 0 |
| 0.8395833333333332 | 0 |
| 0.8402777777777778 | 0 |
| 0.8409722222222222 | 0 |
| 0.8416666666666667 | 0 |
| 0.842361111111111 | 0 |
| 0.8430555555555556 | 0 |
| 0.84375 | 0 |
| 0.8444444444444444 | 0 |
| 0.845138888888889 | 0 |
| 0.8458333333333333 | 0 |
| 0.8465277777777778 | 0 |
| 0.8472222222222222 | 0 |
| 0.8479166666666668 | 0 |
| 0.8486111111111111 | 0 |
| 0.8493055555555555 | 0 |
| 0.85 | 0 |
| 0.8506944444444445 | 0 |
| 0.8513888888888889 | 0 |
| 0.8520833333333333 | 0 |
| 0.8527777777777777 | 0 |
| 0.8534722222222223 | 0 |
| 0.8541666666666666 | 0 |
| 0.8548611111111111 | 0 |
| 0.8555555555555556 | 0 |
| 0.8562500000000001 | 0 |
| 0.8569444444444444 | 0 |
| 0.8576388888888888 | 0 |
| 0.8583333333333334 | 0 |
| 0.8590277777777778 | 0 |
| 0.8597222222222222 | 0 |
| 0.8604166666666666 | 0 |
| 0.8611111111111112 | 0 |
| 0.8618055555555556 | 0 |
| 0.8624999999999999 | 0 |
| 0.8631944444444444 | 0 |
| 0.8638888888888889 | 0 |
| 0.8645833333333334 | 0 |
| 0.8652777777777777 | 0 |
| 0.8659722222222223 | 0 |
| 0.8666666666666667 | 0 |
| 0.8673611111111111 | 0 |
| 0.8680555555555555 | 0 |
| 0.86875 | 0 |
| 0.8694444444444445 | 0 |
| 0.8701388888888889 | 0 |
| 0.8708333333333332 | 0 |
| 0.8715277777777778 | 0 |
| 0.8722222222222222 | 0 |
| 0.8729166666666667 | 0 |
| 0.873611111111111 | 0 |
| 0.8743055555555556 | 0 |
| 0.875 | 0 |
| 0.8756944444444444 | 0 |
| 0.876388888888889 | 0 |
| 0.8770833333333333 | 0 |
| 0.8777777777777778 | 0 |
| 0.8784722222222222 | 0 |
| 0.8791666666666668 | 0 |
| 0.8798611111111111 | 0 |
| 0.8805555555555555 | 0 |
| 0.88125 | 0 |
| 0.8819444444444445 | 0 |
| 0.8826388888888889 | 0 |
| 0.8833333333333333 | 0 |
| 0.8840277777777777 | 0 |
| 0.8847222222222223 | 0 |
| 0.8854166666666666 | 0 |
| 0.8861111111111111 | 0 |
| 0.8868055555555556 | 0 |
| 0.8875000000000001 | 0 |
| 0.8881944444444444 | 0 |
| 0.8888888888888888 | 0 |
| 0.8895833333333334 | 0 |
| 0.8902777777777778 | 0 |
| 0.8909722222222222 | 0 |
| 0.8916666666666666 | 0 |
| 0.8923611111111112 | 0 |
| 0.8930555555555556 | 0 |
| 0.8937499999999999 | 0 |
| 0.8944444444444444 | 0 |
| 0.8951388888888889 | 0 |
| 0.8958333333333334 | 0 |
| 0.8965277777777777 | 0 |
| 0.8972222222222223 | 0 |
| 0.8979166666666667 | 0 |
| 0.8986111111111111 | 0 |
| 0.8993055555555555 | 0 |
| 0.9 | 0 |
| 0.9006944444444445 | 0 |
| 0.9013888888888889 | 0 |
| 0.9020833333333332 | 0 |
| 0.9027777777777778 | 0 |
| 0.9034722222222222 | 0 |
| 0.9041666666666667 | 0 |
| 0.904861111111111 | 0 |
| 0.9055555555555556 | 0 |
| 0.90625 | 0 |
| 0.9069444444444444 | 0 |
| 0.907638888888889 | 0 |
| 0.9083333333333333 | 0 |
| 0.9090277777777778 | 0 |
| 0.9097222222222222 | 0 |
| 0.9104166666666668 | 0 |
| 0.9111111111111111 | 0 |
| 0.9118055555555555 | 0 |
| 0.9125 | 0 |
| 0.9131944444444445 | 0 |
| 0.9138888888888889 | 0 |
| 0.9145833333333333 | 0 |
| 0.9152777777777777 | 0 |
| 0.9159722222222223 | 0 |
| 0.9166666666666666 | 0 |
| 0.9173611111111111 | 0 |
| 0.9180555555555556 | 0 |
| 0.9187500000000001 | 0 |
| 0.9194444444444444 | 0 |
| 0.9201388888888888 | 0 |
| 0.9208333333333334 | 0 |
| 0.9215277777777778 | 0 |
| 0.9222222222222222 | 0 |
| 0.9229166666666666 | 0 |
| 0.9236111111111112 | 0 |
| 0.9243055555555556 | 0 |
| 0.9249999999999999 | 0 |
| 0.9256944444444444 | 0 |
| 0.9263888888888889 | 0 |
| 0.9270833333333334 | 0 |
| 0.9277777777777777 | 0 |
| 0.9284722222222223 | 0 |
| 0.9291666666666667 | 0 |
| 0.9298611111111111 | 0 |
| 0.9305555555555555 | 0 |
| 0.93125 | 0 |
| 0.9319444444444445 | 0 |
| 0.9326388888888889 | 0 |
| 0.9333333333333332 | 0 |
| 0.9340277777777778 | 0 |
| 0.9347222222222222 | 0 |
| 0.9354166666666667 | 0 |
| 0.936111111111111 | 0 |
| 0.9368055555555556 | 0 |
| 0.9375 | 0 |
| 0.9381944444444444 | 0 |
| 0.938888888888889 | 0 |
| 0.9395833333333333 | 0 |
| 0.9402777777777778 | 0 |
| 0.9409722222222222 | 0 |
| 0.9416666666666668 | 0 |
| 0.9423611111111111 | 0 |
| 0.9430555555555555 | 0 |
| 0.94375 | 0 |
| 0.9444444444444445 | 0 |
| 0.9451388888888889 | 0 |
| 0.9458333333333333 | 0 |
| 0.9465277777777777 | 0 |
| 0.9472222222222223 | 0 |
| 0.9479166666666666 | 0 |
| 0.9486111111111111 | 0 |
| 0.9493055555555556 | 0 |
| 0.9500000000000001 | 0 |
| 0.9506944444444444 | 0 |
| 0.9513888888888888 | 0 |
| 0.9520833333333334 | 0 |
| 0.9527777777777778 | 0 |
| 0.9534722222222222 | 0 |
| 0.9541666666666666 | 0 |
| 0.9548611111111112 | 0 |
| 0.9555555555555556 | 0 |
| 0.9562499999999999 | 0 |
| 0.9569444444444444 | 0 |
| 0.9576388888888889 | 0 |
| 0.9583333333333334 | 0 |
| 0.9590277777777777 | 0 |
| 0.9597222222222223 | 0 |
| 0.9604166666666667 | 0 |
| 0.9611111111111111 | 0 |
| 0.9618055555555555 | 0 |
| 0.9625 | 0 |
| 0.9631944444444445 | 0 |
| 0.9638888888888889 | 0 |
| 0.9645833333333332 | 0 |
| 0.9652777777777778 | 0 |
| 0.9659722222222222 | 0 |
| 0.9666666666666667 | 0 |
| 0.967361111111111 | 0 |
| 0.9680555555555556 | 0 |
| 0.96875 | 0 |
| 0.9694444444444444 | 0 |
| 0.970138888888889 | 0 |
| 0.9708333333333333 | 0 |
| 0.9715277777777778 | 0 |
| 0.9722222222222222 | 0 |
| 0.9729166666666668 | 0 |
| 0.9736111111111111 | 0 |
| 0.9743055555555555 | 0 |
| 0.975 | 0 |
| 0.9756944444444445 | 0 |
| 0.9763888888888889 | 0 |
| 0.9770833333333333 | 0 |
| 0.9777777777777777 | 0 |
| 0.9784722222222223 | 0 |
| 0.9791666666666666 | 0 |
| 0.9798611111111111 | 0 |
| 0.9805555555555556 | 0 |
| 0.9812500000000001 | 0 |
| 0.9819444444444444 | 0 |
| 0.9826388888888888 | 0 |
| 0.9833333333333334 | 0 |
| 0.9840277777777778 | 0 |
| 0.9847222222222222 | 0 |
| 0.9854166666666666 | 0 |
| 0.9861111111111112 | 0 |
| 0.9868055555555556 | 0 |
| 0.9874999999999999 | 0 |
| 0.9881944444444444 | 0 |
| 0.9888888888888889 | 0 |
| 0.9895833333333334 | 0 |
| 0.9902777777777777 | 0 |
| 0.9909722222222223 | 0 |
| 0.9916666666666667 | 0 |
| 0.9923611111111111 | 0 |
| 0.9930555555555555 | 0 |
| 0.99375 | 0 |
| 0.9944444444444445 | 0 |
| 0.9951388888888889 | 0 |
| 0.9958333333333332 | 0 |
| 0.9965277777777778 | 0 |
| 0.9972222222222222 | 0 |
| 0.9979166666666667 | 0 |
| 0.998611111111111 | 0 |
| 0.9993055555555556 | 0 |